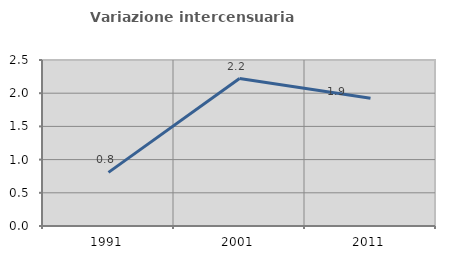
| Category | Variazione intercensuaria annua |
|---|---|
| 1991.0 | 0.807 |
| 2001.0 | 2.221 |
| 2011.0 | 1.923 |